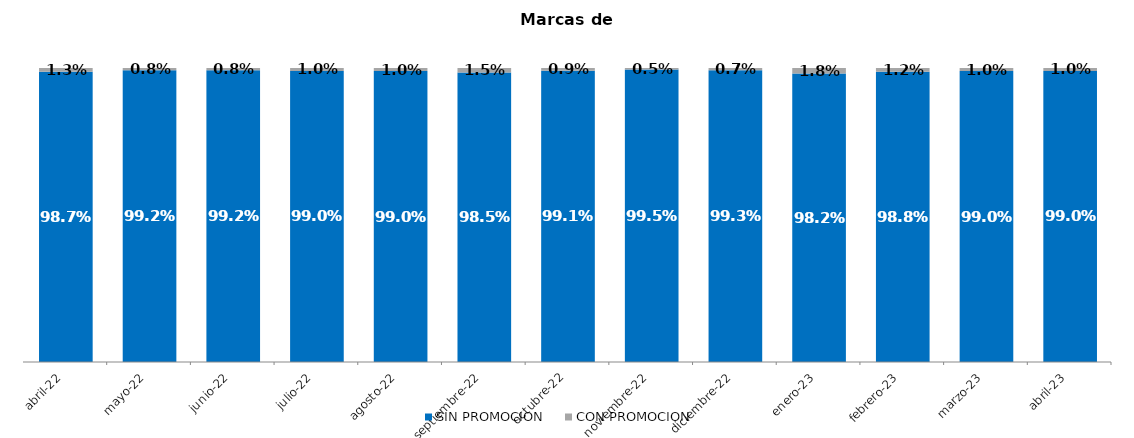
| Category | SIN PROMOCION   | CON PROMOCION   |
|---|---|---|
| 2022-04-01 | 0.987 | 0.013 |
| 2022-05-01 | 0.992 | 0.008 |
| 2022-06-01 | 0.992 | 0.008 |
| 2022-07-01 | 0.99 | 0.01 |
| 2022-08-01 | 0.99 | 0.01 |
| 2022-09-01 | 0.985 | 0.015 |
| 2022-10-01 | 0.991 | 0.009 |
| 2022-11-01 | 0.995 | 0.005 |
| 2022-12-01 | 0.993 | 0.007 |
| 2023-01-01 | 0.982 | 0.018 |
| 2023-02-01 | 0.988 | 0.012 |
| 2023-03-01 | 0.99 | 0.01 |
| 2023-04-01 | 0.99 | 0.01 |